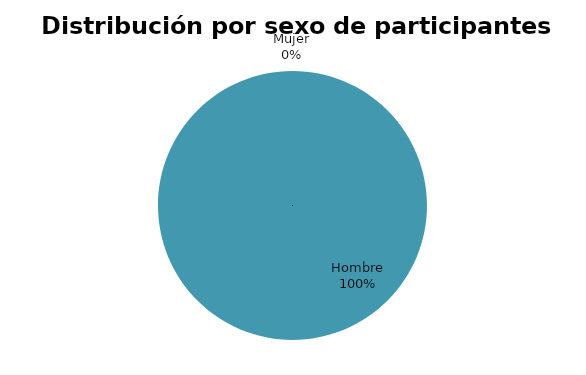
| Category | Series 0 |
|---|---|
| Hombre | 5 |
| Mujer | 0 |